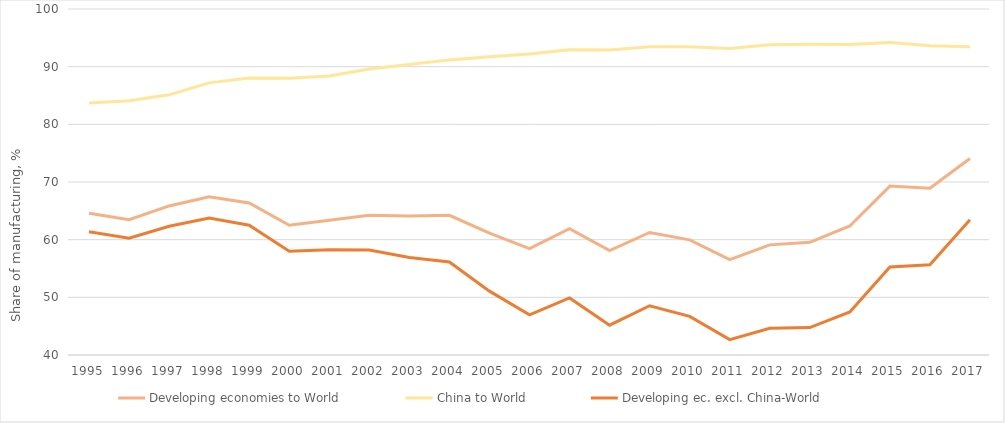
| Category | Developing economies to World | China to World | Developing ec. excl. China-World |
|---|---|---|---|
| 1995.0 | 64.573 | 83.693 | 61.391 |
| 1996.0 | 63.469 | 84.106 | 60.263 |
| 1997.0 | 65.848 | 85.112 | 62.314 |
| 1998.0 | 67.452 | 87.192 | 63.739 |
| 1999.0 | 66.374 | 88.052 | 62.512 |
| 2000.0 | 62.5 | 87.983 | 57.986 |
| 2001.0 | 63.382 | 88.386 | 58.271 |
| 2002.0 | 64.226 | 89.611 | 58.203 |
| 2003.0 | 64.123 | 90.36 | 56.924 |
| 2004.0 | 64.214 | 91.176 | 56.138 |
| 2005.0 | 61.141 | 91.701 | 51.077 |
| 2006.0 | 58.431 | 92.217 | 46.973 |
| 2007.0 | 61.89 | 92.949 | 49.901 |
| 2008.0 | 58.12 | 92.899 | 45.169 |
| 2009.0 | 61.253 | 93.457 | 48.545 |
| 2010.0 | 59.971 | 93.443 | 46.697 |
| 2011.0 | 56.536 | 93.158 | 42.669 |
| 2012.0 | 59.098 | 93.793 | 44.624 |
| 2013.0 | 59.537 | 93.891 | 44.761 |
| 2014.0 | 62.38 | 93.862 | 47.454 |
| 2015.0 | 69.295 | 94.176 | 55.261 |
| 2016.0 | 68.905 | 93.612 | 55.652 |
| 2017.0 | 74.066 | 93.441 | 63.47 |